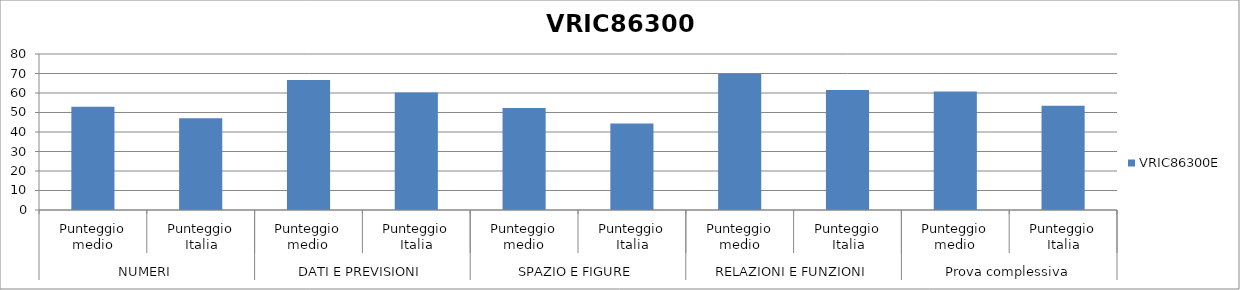
| Category | VRIC86300E |
|---|---|
| 0 | 53 |
| 1 | 47 |
| 2 | 66.7 |
| 3 | 60.2 |
| 4 | 52.3 |
| 5 | 44.3 |
| 6 | 69.9 |
| 7 | 61.5 |
| 8 | 60.8 |
| 9 | 53.5 |